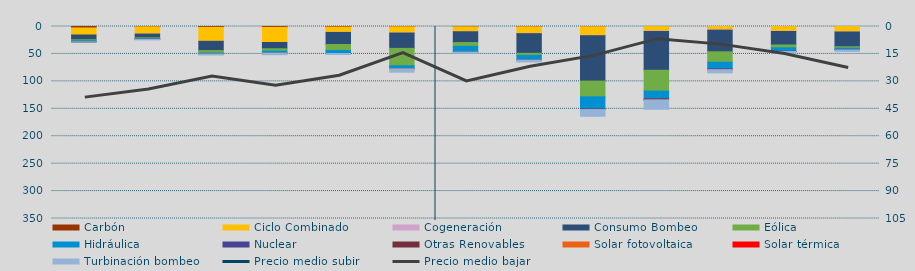
| Category | Carbón | Ciclo Combinado | Cogeneración | Consumo Bombeo | Eólica | Hidráulica | Nuclear | Otras Renovables | Solar fotovoltaica | Solar térmica | Turbinación bombeo |
|---|---|---|---|---|---|---|---|---|---|---|---|
| J | 2658.9 | 12785.9 | 0 | 8749.3 | 1887.5 | 1893.1 | 0 | 9.8 | 0 | 0 | 57.5 |
| A | 567.2 | 13236.4 | 10 | 6766.4 | 1241.9 | 1156.9 | 173 | 38 | 0 | 0 | 1232.6 |
| S | 1539.8 | 25452.8 | 8.7 | 16928.4 | 4457.4 | 1540.4 | 0 | 149.5 | 0 | 0 | 1916.2 |
| O | 1567.5 | 27564.7 | 0 | 11468.6 | 4269.6 | 3292.2 | 0 | 125.3 | 0 | 0 | 3130.6 |
| N | 1032.3 | 9659.8 | 141 | 22022.6 | 10965.1 | 5345.6 | 22.6 | 8.3 | 0 | 0 | 1780.7 |
| D | 528.1 | 11341.1 | 86.5 | 27911.2 | 31665.4 | 5608.2 | 0 | 173.7 | 5.9 | 0 | 6026.2 |
| E | 543.5 | 9049.8 | 14.2 | 19673 | 6854.8 | 10347.8 | 0 | 7.7 | 0 | 0 | 2307.6 |
| F | 538.4 | 12495.4 | 57.7 | 35793.2 | 3820.7 | 8168.3 | 0 | 265.3 | 0 | 0 | 3575.3 |
| M | 386.4 | 15979.9 | 321.7 | 82837 | 28654.5 | 22332.5 | 0 | 917.9 | 0 | 0 | 12258.3 |
| A | 97.2 | 8073.6 | 752.2 | 70876 | 37936.3 | 14340.4 | 0 | 1671.6 | 79.6 | 6.4 | 17035.3 |
| M | 18.3 | 6034.6 | 724.9 | 39295.9 | 19044.2 | 12773.5 | 8 | 691.1 | 39.5 | 82.2 | 5747.6 |
| J | 76.6 | 8592.1 | 398.7 | 24576 | 5144.6 | 6431.8 | 0 | 324 | 34.6 | 38.7 | 3246.7 |
| J | 1 | 9886.9 | 142.6 | 26857.1 | 2569.3 | 2887.6 | 128.7 | 129.9 | 0 | 0 | 2875.8 |